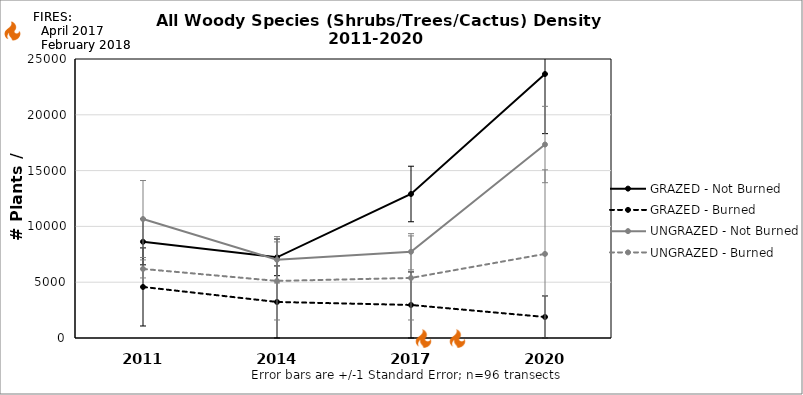
| Category | GRAZED - Not Burned | GRAZED - Burned | UNGRAZED - Not Burned | UNGRAZED - Burned |
|---|---|---|---|---|
| 2011.0 | 8623.934 | 4574.658 | 10661.387 | 6189.242 |
| 2014.0 | 7227.19 | 3229.17 | 7009.349 | 5112.853 |
| 2017.0 | 12903.866 | 2960.072 | 7726.943 | 5381.95 |
| 2020.0 | 23654.952 | 1883.683 | 17337.568 | 7534.73 |